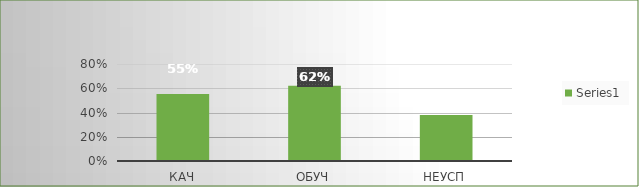
| Category | Series 0 |
|---|---|
| кач | 0.552 |
| обуч | 0.621 |
| неусп | 0.379 |